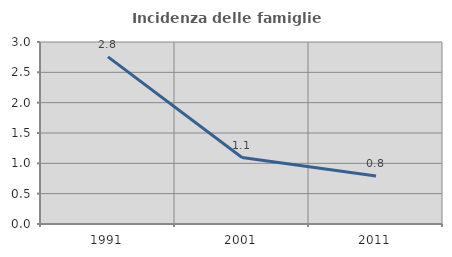
| Category | Incidenza delle famiglie numerose |
|---|---|
| 1991.0 | 2.755 |
| 2001.0 | 1.095 |
| 2011.0 | 0.79 |